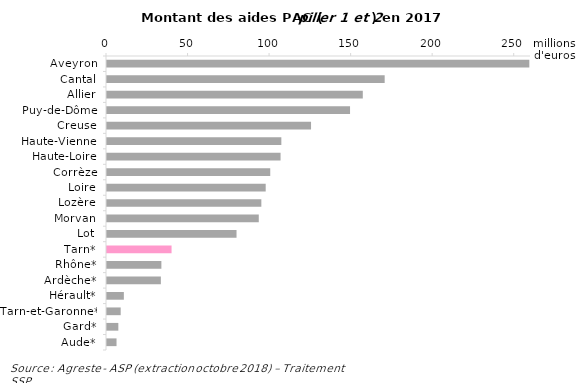
| Category | Evolution du montant
Valeur absolue
En millions d’euros |
|---|---|
| Aveyron | 258.974 |
| Cantal | 170.272 |
| Allier | 156.857 |
| Puy-de-Dôme | 149.036 |
| Creuse | 125.12 |
| Haute-Vienne | 106.911 |
| Haute-Loire | 106.426 |
| Corrèze | 100.099 |
| Loire | 97.315 |
| Lozère | 94.643 |
| Morvan | 93.071 |
| Lot | 79.43 |
| Tarn* | 39.589 |
| Rhône* | 33.344 |
| Ardèche* | 33.027 |
| Hérault* | 10.332 |
| Tarn-et-Garonne* | 8.395 |
| Gard* | 6.947 |
| Aude* | 5.844 |